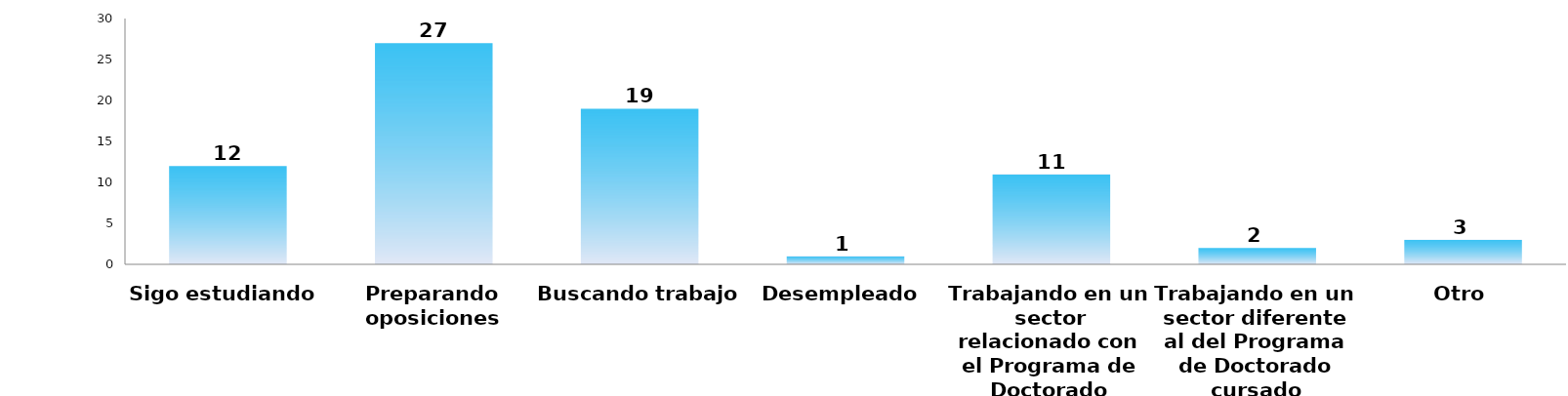
| Category | Series 0 |
|---|---|
| Sigo estudiando | 12 |
| Preparando oposiciones | 27 |
| Buscando trabajo | 19 |
| Desempleado | 1 |
| Trabajando en un sector relacionado con el Programa de Doctorado cursado | 11 |
| Trabajando en un sector diferente al del Programa de Doctorado cursado | 2 |
| Otro | 3 |